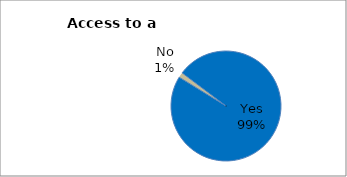
| Category | Series 0 |
|---|---|
| Yes | 98.504 |
| No | 1.496 |